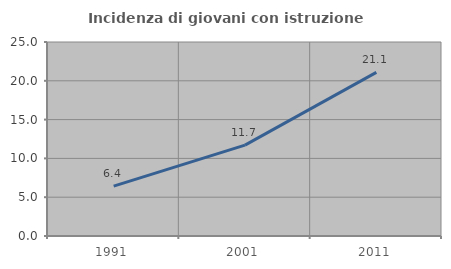
| Category | Incidenza di giovani con istruzione universitaria |
|---|---|
| 1991.0 | 6.422 |
| 2001.0 | 11.715 |
| 2011.0 | 21.081 |